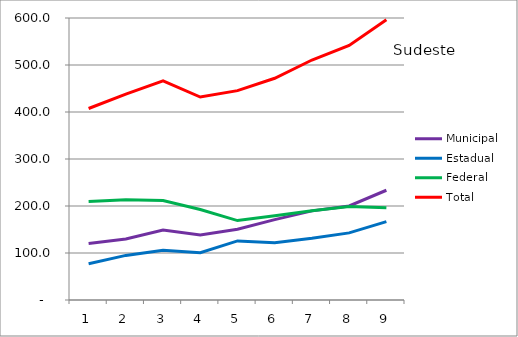
| Category | Municipal | Estadual | Federal | Total |
|---|---|---|---|---|
| 1.0 | 120.3 | 77.3 | 209.8 | 407.4 |